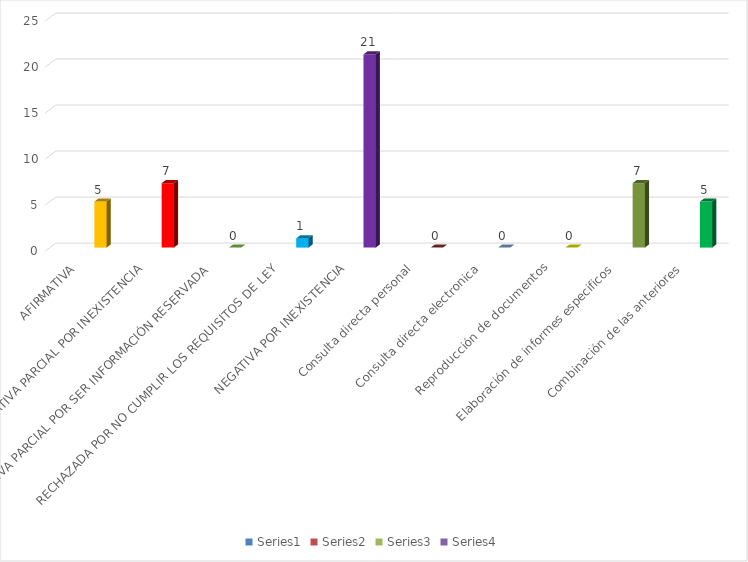
| Category | Series 0 | Series 1 | Series 2 | Series 3 |
|---|---|---|---|---|
| AFIRMATIVA |  |  |  | 5 |
| AFIRMATIVA PARCIAL POR INEXISTENCIA |  |  |  | 7 |
| AFIRMATIVA PARCIAL POR SER INFORMACIÓN RESERVADA |  |  |  | 0 |
| RECHAZADA POR NO CUMPLIR LOS REQUISITOS DE LEY |  |  |  | 1 |
| NEGATIVA POR INEXISTENCIA |  |  |  | 21 |
| Consulta directa personal |  |  |  | 0 |
| Consulta directa electronica |  |  |  | 0 |
| Reproducción de documentos |  |  |  | 0 |
| Elaboración de informes especificos |  |  |  | 7 |
| Combinación de las anteriores |  |  |  | 5 |